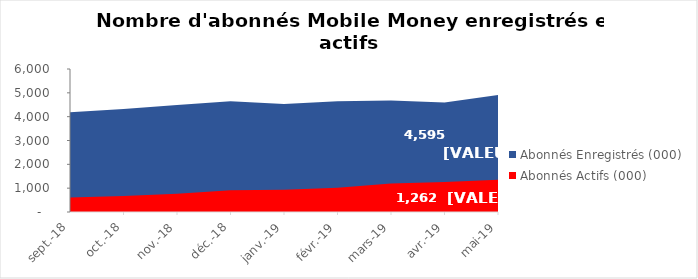
| Category | Abonnés Enregistrés (000) | Abonnés Actifs (000) |
|---|---|---|
| 2018-09-01 | 4186.321 | 612.774 |
| 2018-10-01 | 4322.627 | 674.073 |
| 2018-11-01 | 4493.34 | 766.339 |
| 2018-12-01 | 4644.562 | 911.789 |
| 2019-01-01 | 4527.359 | 930.174 |
| 2019-02-01 | 4647.251 | 1020.836 |
| 2019-03-01 | 4674.727 | 1191.865 |
| 2019-04-01 | 4594.933 | 1262.375 |
| 2019-05-01 | 4906.39 | 1348.464 |